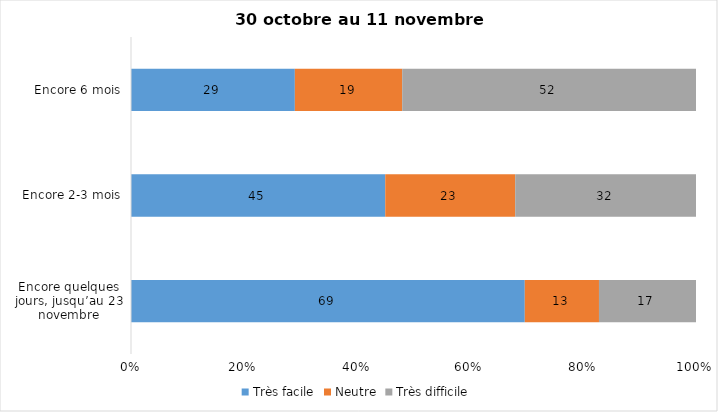
| Category | Très facile | Neutre | Très difficile |
|---|---|---|---|
| Encore quelques jours, jusqu’au 23 novembre | 69 | 13 | 17 |
| Encore 2-3 mois | 45 | 23 | 32 |
| Encore 6 mois | 29 | 19 | 52 |